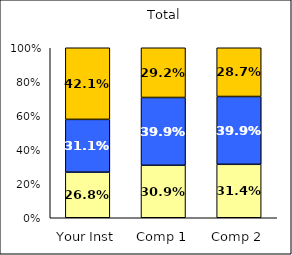
| Category | Low Negative Cross-Racial Interaction | Average Negative Cross-Racial Interaction | High Negative Cross-Racial Interaction |
|---|---|---|---|
| Your Inst | 0.268 | 0.311 | 0.421 |
| Comp 1 | 0.309 | 0.399 | 0.292 |
| Comp 2 | 0.314 | 0.399 | 0.287 |